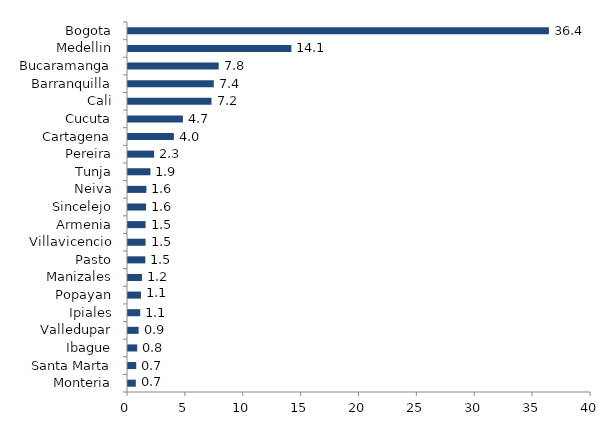
| Category | Series 0 |
|---|---|
| Monteria | 0.676 |
| Santa Marta | 0.712 |
| Ibague | 0.798 |
| Valledupar | 0.916 |
| Ipiales | 1.056 |
| Popayan | 1.119 |
| Manizales | 1.206 |
| Pasto | 1.498 |
| Villavicencio | 1.517 |
| Armenia | 1.517 |
| Sincelejo | 1.56 |
| Neiva | 1.586 |
| Tunja | 1.94 |
| Pereira | 2.256 |
| Cartagena | 3.961 |
| Cucuta | 4.741 |
| Cali | 7.215 |
| Barranquilla | 7.414 |
| Bucaramanga | 7.834 |
| Medellin | 14.115 |
| Bogota | 36.363 |